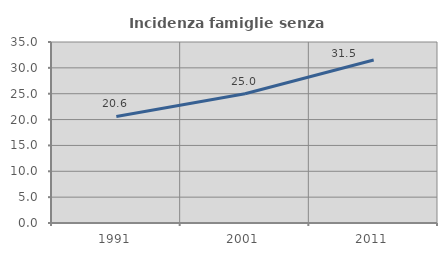
| Category | Incidenza famiglie senza nuclei |
|---|---|
| 1991.0 | 20.608 |
| 2001.0 | 24.98 |
| 2011.0 | 31.509 |